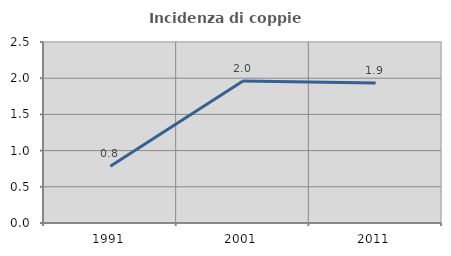
| Category | Incidenza di coppie miste |
|---|---|
| 1991.0 | 0.784 |
| 2001.0 | 1.961 |
| 2011.0 | 1.932 |